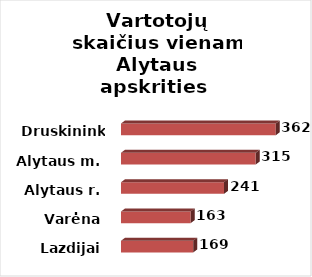
| Category | Series 0 |
|---|---|
| Lazdijai | 169 |
| Varėna | 163 |
| Alytaus r. | 241 |
| Alytaus m. | 315 |
| Druskininkai | 362 |